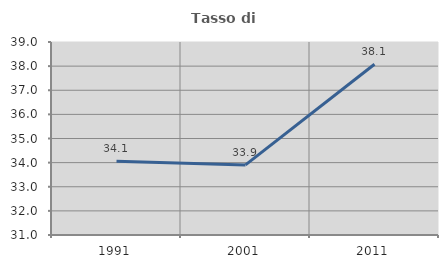
| Category | Tasso di occupazione   |
|---|---|
| 1991.0 | 34.053 |
| 2001.0 | 33.905 |
| 2011.0 | 38.08 |